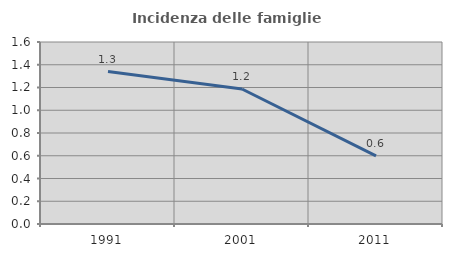
| Category | Incidenza delle famiglie numerose |
|---|---|
| 1991.0 | 1.34 |
| 2001.0 | 1.187 |
| 2011.0 | 0.599 |